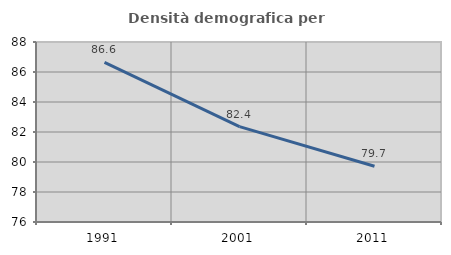
| Category | Densità demografica |
|---|---|
| 1991.0 | 86.637 |
| 2001.0 | 82.355 |
| 2011.0 | 79.712 |